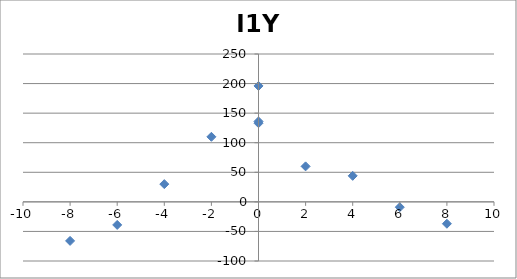
| Category | I1Y |
|---|---|
| 0.0 | 196 |
| 2.0 | 60 |
| 4.0 | 44 |
| 6.0 | -9 |
| 8.0 | -37 |
| 0.0 | 133 |
| -2.0 | 110 |
| -4.0 | 30 |
| -6.0 | -39 |
| -8.0 | -66 |
| 0.0 | 136 |